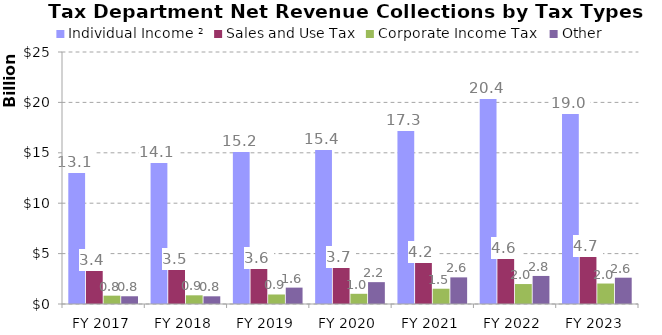
| Category | Individual Income ² | Sales and Use Tax | Corporate Income Tax  | Other |
|---|---|---|---|---|
| FY 2017 | 13052887000 | 3354561000 | 826960822.31 | 767401177.69 |
| FY 2018 | 14105766000 | 3458249000 | 861897138.18 | 763035861.82 |
| FY 2019 | 15226471000 | 3580355000 | 943391000 | 1625197140.2 |
| FY 2020 | 15351592000 | 3706817000 | 1011650000 | 2167788628.13 |
| FY 2021 | 17303666000 | 4166182000 | 1515692000 | 2641396000 |
| FY 2022 | 20410203000 | 4558082000 | 1978697000 | 2782131000 |
| FY 2023 | 18983555000 | 4734549000 | 2031120000 | 2609863000 |